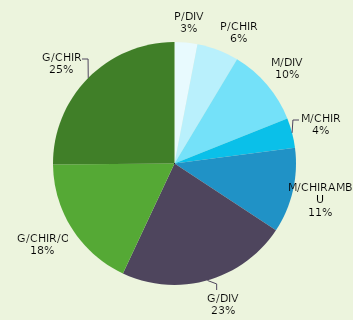
| Category | Series 0 |
|---|---|
| P/DIV | 0.03 |
| P/CHIR | 0.056 |
| M/DIV | 0.103 |
| M/CHIR | 0.04 |
| M/CHIRAMBU | 0.113 |
| G/DIV | 0.227 |
| G/CHIR/O | 0.179 |
| G/CHIR | 0.251 |